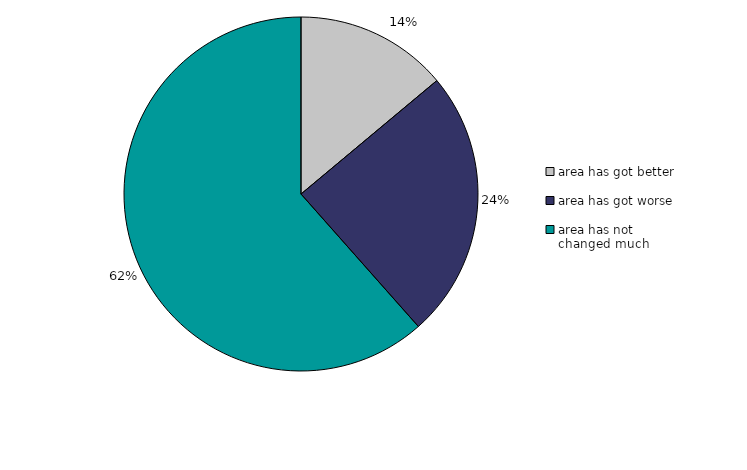
| Category | Series 0 |
|---|---|
| area has got better | 13.928 |
| area has got worse | 24.534 |
| area has not changed much | 61.538 |